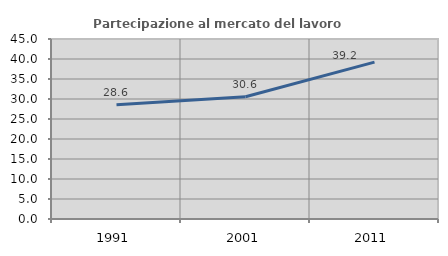
| Category | Partecipazione al mercato del lavoro  femminile |
|---|---|
| 1991.0 | 28.571 |
| 2001.0 | 30.559 |
| 2011.0 | 39.226 |